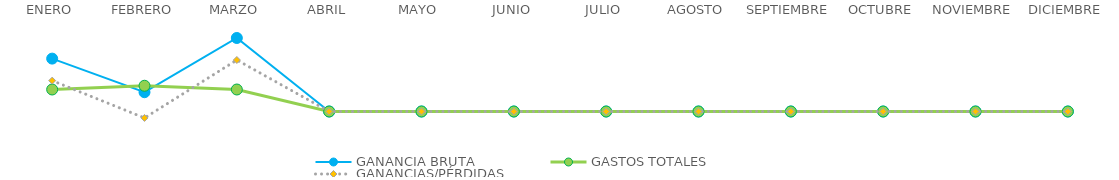
| Category | GANANCIA BRUTA | GASTOS TOTALES | GANANCIAS/PÉRDIDAS |
|---|---|---|---|
| ENERO | 192300 | 80000 | 112300 |
| FEBRERO | 70100 | 93600 | -23500 |
| MARZO | 267300 | 80000 | 187300 |
| ABRIL | 0 | 0 | 0 |
| MAYO | 0 | 0 | 0 |
| JUNIO | 0 | 0 | 0 |
| JULIO | 0 | 0 | 0 |
| AGOSTO | 0 | 0 | 0 |
| SEPTIEMBRE | 0 | 0 | 0 |
| OCTUBRE | 0 | 0 | 0 |
| NOVIEMBRE | 0 | 0 | 0 |
| DICIEMBRE | 0 | 0 | 0 |